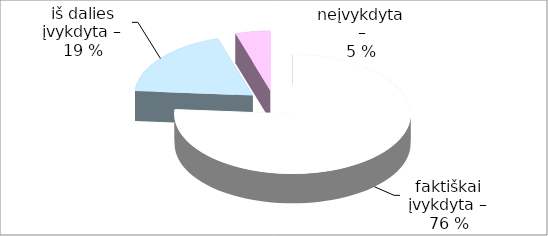
| Category | Series 0 |
|---|---|
| 0 | 16 |
| 1 | 4 |
| 2 | 1 |